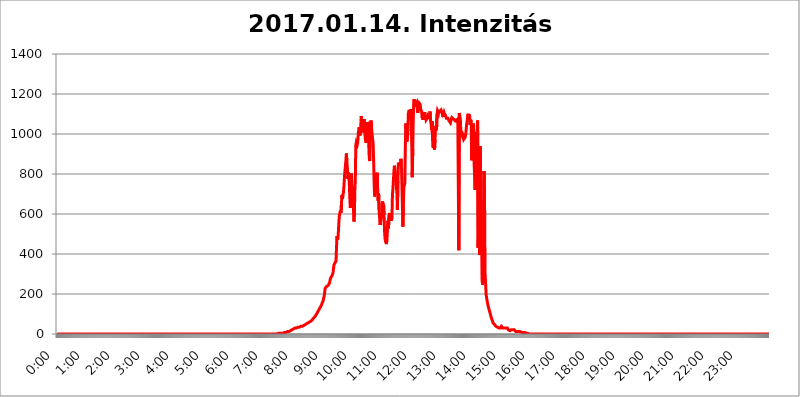
| Category | 2017.01.14. Intenzitás [W/m^2] |
|---|---|
| 0.0 | 0 |
| 0.0006944444444444445 | 0 |
| 0.001388888888888889 | 0 |
| 0.0020833333333333333 | 0 |
| 0.002777777777777778 | 0 |
| 0.003472222222222222 | 0 |
| 0.004166666666666667 | 0 |
| 0.004861111111111111 | 0 |
| 0.005555555555555556 | 0 |
| 0.0062499999999999995 | 0 |
| 0.006944444444444444 | 0 |
| 0.007638888888888889 | 0 |
| 0.008333333333333333 | 0 |
| 0.009027777777777779 | 0 |
| 0.009722222222222222 | 0 |
| 0.010416666666666666 | 0 |
| 0.011111111111111112 | 0 |
| 0.011805555555555555 | 0 |
| 0.012499999999999999 | 0 |
| 0.013194444444444444 | 0 |
| 0.013888888888888888 | 0 |
| 0.014583333333333332 | 0 |
| 0.015277777777777777 | 0 |
| 0.015972222222222224 | 0 |
| 0.016666666666666666 | 0 |
| 0.017361111111111112 | 0 |
| 0.018055555555555557 | 0 |
| 0.01875 | 0 |
| 0.019444444444444445 | 0 |
| 0.02013888888888889 | 0 |
| 0.020833333333333332 | 0 |
| 0.02152777777777778 | 0 |
| 0.022222222222222223 | 0 |
| 0.02291666666666667 | 0 |
| 0.02361111111111111 | 0 |
| 0.024305555555555556 | 0 |
| 0.024999999999999998 | 0 |
| 0.025694444444444447 | 0 |
| 0.02638888888888889 | 0 |
| 0.027083333333333334 | 0 |
| 0.027777777777777776 | 0 |
| 0.02847222222222222 | 0 |
| 0.029166666666666664 | 0 |
| 0.029861111111111113 | 0 |
| 0.030555555555555555 | 0 |
| 0.03125 | 0 |
| 0.03194444444444445 | 0 |
| 0.03263888888888889 | 0 |
| 0.03333333333333333 | 0 |
| 0.034027777777777775 | 0 |
| 0.034722222222222224 | 0 |
| 0.035416666666666666 | 0 |
| 0.036111111111111115 | 0 |
| 0.03680555555555556 | 0 |
| 0.0375 | 0 |
| 0.03819444444444444 | 0 |
| 0.03888888888888889 | 0 |
| 0.03958333333333333 | 0 |
| 0.04027777777777778 | 0 |
| 0.04097222222222222 | 0 |
| 0.041666666666666664 | 0 |
| 0.042361111111111106 | 0 |
| 0.04305555555555556 | 0 |
| 0.043750000000000004 | 0 |
| 0.044444444444444446 | 0 |
| 0.04513888888888889 | 0 |
| 0.04583333333333334 | 0 |
| 0.04652777777777778 | 0 |
| 0.04722222222222222 | 0 |
| 0.04791666666666666 | 0 |
| 0.04861111111111111 | 0 |
| 0.049305555555555554 | 0 |
| 0.049999999999999996 | 0 |
| 0.05069444444444445 | 0 |
| 0.051388888888888894 | 0 |
| 0.052083333333333336 | 0 |
| 0.05277777777777778 | 0 |
| 0.05347222222222222 | 0 |
| 0.05416666666666667 | 0 |
| 0.05486111111111111 | 0 |
| 0.05555555555555555 | 0 |
| 0.05625 | 0 |
| 0.05694444444444444 | 0 |
| 0.057638888888888885 | 0 |
| 0.05833333333333333 | 0 |
| 0.05902777777777778 | 0 |
| 0.059722222222222225 | 0 |
| 0.06041666666666667 | 0 |
| 0.061111111111111116 | 0 |
| 0.06180555555555556 | 0 |
| 0.0625 | 0 |
| 0.06319444444444444 | 0 |
| 0.06388888888888888 | 0 |
| 0.06458333333333334 | 0 |
| 0.06527777777777778 | 0 |
| 0.06597222222222222 | 0 |
| 0.06666666666666667 | 0 |
| 0.06736111111111111 | 0 |
| 0.06805555555555555 | 0 |
| 0.06874999999999999 | 0 |
| 0.06944444444444443 | 0 |
| 0.07013888888888889 | 0 |
| 0.07083333333333333 | 0 |
| 0.07152777777777779 | 0 |
| 0.07222222222222223 | 0 |
| 0.07291666666666667 | 0 |
| 0.07361111111111111 | 0 |
| 0.07430555555555556 | 0 |
| 0.075 | 0 |
| 0.07569444444444444 | 0 |
| 0.0763888888888889 | 0 |
| 0.07708333333333334 | 0 |
| 0.07777777777777778 | 0 |
| 0.07847222222222222 | 0 |
| 0.07916666666666666 | 0 |
| 0.0798611111111111 | 0 |
| 0.08055555555555556 | 0 |
| 0.08125 | 0 |
| 0.08194444444444444 | 0 |
| 0.08263888888888889 | 0 |
| 0.08333333333333333 | 0 |
| 0.08402777777777777 | 0 |
| 0.08472222222222221 | 0 |
| 0.08541666666666665 | 0 |
| 0.08611111111111112 | 0 |
| 0.08680555555555557 | 0 |
| 0.08750000000000001 | 0 |
| 0.08819444444444445 | 0 |
| 0.08888888888888889 | 0 |
| 0.08958333333333333 | 0 |
| 0.09027777777777778 | 0 |
| 0.09097222222222222 | 0 |
| 0.09166666666666667 | 0 |
| 0.09236111111111112 | 0 |
| 0.09305555555555556 | 0 |
| 0.09375 | 0 |
| 0.09444444444444444 | 0 |
| 0.09513888888888888 | 0 |
| 0.09583333333333333 | 0 |
| 0.09652777777777777 | 0 |
| 0.09722222222222222 | 0 |
| 0.09791666666666667 | 0 |
| 0.09861111111111111 | 0 |
| 0.09930555555555555 | 0 |
| 0.09999999999999999 | 0 |
| 0.10069444444444443 | 0 |
| 0.1013888888888889 | 0 |
| 0.10208333333333335 | 0 |
| 0.10277777777777779 | 0 |
| 0.10347222222222223 | 0 |
| 0.10416666666666667 | 0 |
| 0.10486111111111111 | 0 |
| 0.10555555555555556 | 0 |
| 0.10625 | 0 |
| 0.10694444444444444 | 0 |
| 0.1076388888888889 | 0 |
| 0.10833333333333334 | 0 |
| 0.10902777777777778 | 0 |
| 0.10972222222222222 | 0 |
| 0.1111111111111111 | 0 |
| 0.11180555555555556 | 0 |
| 0.11180555555555556 | 0 |
| 0.1125 | 0 |
| 0.11319444444444444 | 0 |
| 0.11388888888888889 | 0 |
| 0.11458333333333333 | 0 |
| 0.11527777777777777 | 0 |
| 0.11597222222222221 | 0 |
| 0.11666666666666665 | 0 |
| 0.1173611111111111 | 0 |
| 0.11805555555555557 | 0 |
| 0.11944444444444445 | 0 |
| 0.12013888888888889 | 0 |
| 0.12083333333333333 | 0 |
| 0.12152777777777778 | 0 |
| 0.12222222222222223 | 0 |
| 0.12291666666666667 | 0 |
| 0.12291666666666667 | 0 |
| 0.12361111111111112 | 0 |
| 0.12430555555555556 | 0 |
| 0.125 | 0 |
| 0.12569444444444444 | 0 |
| 0.12638888888888888 | 0 |
| 0.12708333333333333 | 0 |
| 0.16875 | 0 |
| 0.12847222222222224 | 0 |
| 0.12916666666666668 | 0 |
| 0.12986111111111112 | 0 |
| 0.13055555555555556 | 0 |
| 0.13125 | 0 |
| 0.13194444444444445 | 0 |
| 0.1326388888888889 | 0 |
| 0.13333333333333333 | 0 |
| 0.13402777777777777 | 0 |
| 0.13402777777777777 | 0 |
| 0.13472222222222222 | 0 |
| 0.13541666666666666 | 0 |
| 0.1361111111111111 | 0 |
| 0.13749999999999998 | 0 |
| 0.13819444444444443 | 0 |
| 0.1388888888888889 | 0 |
| 0.13958333333333334 | 0 |
| 0.14027777777777778 | 0 |
| 0.14097222222222222 | 0 |
| 0.14166666666666666 | 0 |
| 0.1423611111111111 | 0 |
| 0.14305555555555557 | 0 |
| 0.14375000000000002 | 0 |
| 0.14444444444444446 | 0 |
| 0.1451388888888889 | 0 |
| 0.1451388888888889 | 0 |
| 0.14652777777777778 | 0 |
| 0.14722222222222223 | 0 |
| 0.14791666666666667 | 0 |
| 0.1486111111111111 | 0 |
| 0.14930555555555555 | 0 |
| 0.15 | 0 |
| 0.15069444444444444 | 0 |
| 0.15138888888888888 | 0 |
| 0.15208333333333332 | 0 |
| 0.15277777777777776 | 0 |
| 0.15347222222222223 | 0 |
| 0.15416666666666667 | 0 |
| 0.15486111111111112 | 0 |
| 0.15555555555555556 | 0 |
| 0.15625 | 0 |
| 0.15694444444444444 | 0 |
| 0.15763888888888888 | 0 |
| 0.15833333333333333 | 0 |
| 0.15902777777777777 | 0 |
| 0.15972222222222224 | 0 |
| 0.16041666666666668 | 0 |
| 0.16111111111111112 | 0 |
| 0.16180555555555556 | 0 |
| 0.1625 | 0 |
| 0.16319444444444445 | 0 |
| 0.1638888888888889 | 0 |
| 0.16458333333333333 | 0 |
| 0.16527777777777777 | 0 |
| 0.16597222222222222 | 0 |
| 0.16666666666666666 | 0 |
| 0.1673611111111111 | 0 |
| 0.16805555555555554 | 0 |
| 0.16874999999999998 | 0 |
| 0.16944444444444443 | 0 |
| 0.17013888888888887 | 0 |
| 0.1708333333333333 | 0 |
| 0.17152777777777775 | 0 |
| 0.17222222222222225 | 0 |
| 0.1729166666666667 | 0 |
| 0.17361111111111113 | 0 |
| 0.17430555555555557 | 0 |
| 0.17500000000000002 | 0 |
| 0.17569444444444446 | 0 |
| 0.1763888888888889 | 0 |
| 0.17708333333333334 | 0 |
| 0.17777777777777778 | 0 |
| 0.17847222222222223 | 0 |
| 0.17916666666666667 | 0 |
| 0.1798611111111111 | 0 |
| 0.18055555555555555 | 0 |
| 0.18125 | 0 |
| 0.18194444444444444 | 0 |
| 0.1826388888888889 | 0 |
| 0.18333333333333335 | 0 |
| 0.1840277777777778 | 0 |
| 0.18472222222222223 | 0 |
| 0.18541666666666667 | 0 |
| 0.18611111111111112 | 0 |
| 0.18680555555555556 | 0 |
| 0.1875 | 0 |
| 0.18819444444444444 | 0 |
| 0.18888888888888888 | 0 |
| 0.18958333333333333 | 0 |
| 0.19027777777777777 | 0 |
| 0.1909722222222222 | 0 |
| 0.19166666666666665 | 0 |
| 0.19236111111111112 | 0 |
| 0.19305555555555554 | 0 |
| 0.19375 | 0 |
| 0.19444444444444445 | 0 |
| 0.1951388888888889 | 0 |
| 0.19583333333333333 | 0 |
| 0.19652777777777777 | 0 |
| 0.19722222222222222 | 0 |
| 0.19791666666666666 | 0 |
| 0.1986111111111111 | 0 |
| 0.19930555555555554 | 0 |
| 0.19999999999999998 | 0 |
| 0.20069444444444443 | 0 |
| 0.20138888888888887 | 0 |
| 0.2020833333333333 | 0 |
| 0.2027777777777778 | 0 |
| 0.2034722222222222 | 0 |
| 0.2041666666666667 | 0 |
| 0.20486111111111113 | 0 |
| 0.20555555555555557 | 0 |
| 0.20625000000000002 | 0 |
| 0.20694444444444446 | 0 |
| 0.2076388888888889 | 0 |
| 0.20833333333333334 | 0 |
| 0.20902777777777778 | 0 |
| 0.20972222222222223 | 0 |
| 0.21041666666666667 | 0 |
| 0.2111111111111111 | 0 |
| 0.21180555555555555 | 0 |
| 0.2125 | 0 |
| 0.21319444444444444 | 0 |
| 0.2138888888888889 | 0 |
| 0.21458333333333335 | 0 |
| 0.2152777777777778 | 0 |
| 0.21597222222222223 | 0 |
| 0.21666666666666667 | 0 |
| 0.21736111111111112 | 0 |
| 0.21805555555555556 | 0 |
| 0.21875 | 0 |
| 0.21944444444444444 | 0 |
| 0.22013888888888888 | 0 |
| 0.22083333333333333 | 0 |
| 0.22152777777777777 | 0 |
| 0.2222222222222222 | 0 |
| 0.22291666666666665 | 0 |
| 0.2236111111111111 | 0 |
| 0.22430555555555556 | 0 |
| 0.225 | 0 |
| 0.22569444444444445 | 0 |
| 0.2263888888888889 | 0 |
| 0.22708333333333333 | 0 |
| 0.22777777777777777 | 0 |
| 0.22847222222222222 | 0 |
| 0.22916666666666666 | 0 |
| 0.2298611111111111 | 0 |
| 0.23055555555555554 | 0 |
| 0.23124999999999998 | 0 |
| 0.23194444444444443 | 0 |
| 0.23263888888888887 | 0 |
| 0.2333333333333333 | 0 |
| 0.2340277777777778 | 0 |
| 0.2347222222222222 | 0 |
| 0.2354166666666667 | 0 |
| 0.23611111111111113 | 0 |
| 0.23680555555555557 | 0 |
| 0.23750000000000002 | 0 |
| 0.23819444444444446 | 0 |
| 0.2388888888888889 | 0 |
| 0.23958333333333334 | 0 |
| 0.24027777777777778 | 0 |
| 0.24097222222222223 | 0 |
| 0.24166666666666667 | 0 |
| 0.2423611111111111 | 0 |
| 0.24305555555555555 | 0 |
| 0.24375 | 0 |
| 0.24444444444444446 | 0 |
| 0.24513888888888888 | 0 |
| 0.24583333333333335 | 0 |
| 0.2465277777777778 | 0 |
| 0.24722222222222223 | 0 |
| 0.24791666666666667 | 0 |
| 0.24861111111111112 | 0 |
| 0.24930555555555556 | 0 |
| 0.25 | 0 |
| 0.25069444444444444 | 0 |
| 0.2513888888888889 | 0 |
| 0.2520833333333333 | 0 |
| 0.25277777777777777 | 0 |
| 0.2534722222222222 | 0 |
| 0.25416666666666665 | 0 |
| 0.2548611111111111 | 0 |
| 0.2555555555555556 | 0 |
| 0.25625000000000003 | 0 |
| 0.2569444444444445 | 0 |
| 0.2576388888888889 | 0 |
| 0.25833333333333336 | 0 |
| 0.2590277777777778 | 0 |
| 0.25972222222222224 | 0 |
| 0.2604166666666667 | 0 |
| 0.2611111111111111 | 0 |
| 0.26180555555555557 | 0 |
| 0.2625 | 0 |
| 0.26319444444444445 | 0 |
| 0.2638888888888889 | 0 |
| 0.26458333333333334 | 0 |
| 0.2652777777777778 | 0 |
| 0.2659722222222222 | 0 |
| 0.26666666666666666 | 0 |
| 0.2673611111111111 | 0 |
| 0.26805555555555555 | 0 |
| 0.26875 | 0 |
| 0.26944444444444443 | 0 |
| 0.2701388888888889 | 0 |
| 0.2708333333333333 | 0 |
| 0.27152777777777776 | 0 |
| 0.2722222222222222 | 0 |
| 0.27291666666666664 | 0 |
| 0.2736111111111111 | 0 |
| 0.2743055555555555 | 0 |
| 0.27499999999999997 | 0 |
| 0.27569444444444446 | 0 |
| 0.27638888888888885 | 0 |
| 0.27708333333333335 | 0 |
| 0.2777777777777778 | 0 |
| 0.27847222222222223 | 0 |
| 0.2791666666666667 | 0 |
| 0.2798611111111111 | 0 |
| 0.28055555555555556 | 0 |
| 0.28125 | 0 |
| 0.28194444444444444 | 0 |
| 0.2826388888888889 | 0 |
| 0.2833333333333333 | 0 |
| 0.28402777777777777 | 0 |
| 0.2847222222222222 | 0 |
| 0.28541666666666665 | 0 |
| 0.28611111111111115 | 0 |
| 0.28680555555555554 | 0 |
| 0.28750000000000003 | 0 |
| 0.2881944444444445 | 0 |
| 0.2888888888888889 | 0 |
| 0.28958333333333336 | 0 |
| 0.2902777777777778 | 0 |
| 0.29097222222222224 | 0 |
| 0.2916666666666667 | 0 |
| 0.2923611111111111 | 0 |
| 0.29305555555555557 | 0 |
| 0.29375 | 0 |
| 0.29444444444444445 | 0 |
| 0.2951388888888889 | 0 |
| 0.29583333333333334 | 0 |
| 0.2965277777777778 | 0 |
| 0.2972222222222222 | 0 |
| 0.29791666666666666 | 0 |
| 0.2986111111111111 | 0 |
| 0.29930555555555555 | 0 |
| 0.3 | 0 |
| 0.30069444444444443 | 0 |
| 0.3013888888888889 | 0 |
| 0.3020833333333333 | 0 |
| 0.30277777777777776 | 0 |
| 0.3034722222222222 | 0 |
| 0.30416666666666664 | 0 |
| 0.3048611111111111 | 0 |
| 0.3055555555555555 | 0 |
| 0.30624999999999997 | 0 |
| 0.3069444444444444 | 0 |
| 0.3076388888888889 | 0 |
| 0.30833333333333335 | 0 |
| 0.3090277777777778 | 0 |
| 0.30972222222222223 | 3.525 |
| 0.3104166666666667 | 3.525 |
| 0.3111111111111111 | 3.525 |
| 0.31180555555555556 | 3.525 |
| 0.3125 | 3.525 |
| 0.31319444444444444 | 3.525 |
| 0.3138888888888889 | 3.525 |
| 0.3145833333333333 | 3.525 |
| 0.31527777777777777 | 3.525 |
| 0.3159722222222222 | 3.525 |
| 0.31666666666666665 | 3.525 |
| 0.31736111111111115 | 7.887 |
| 0.31805555555555554 | 7.887 |
| 0.31875000000000003 | 7.887 |
| 0.3194444444444445 | 7.887 |
| 0.3201388888888889 | 7.887 |
| 0.32083333333333336 | 7.887 |
| 0.3215277777777778 | 12.257 |
| 0.32222222222222224 | 12.257 |
| 0.3229166666666667 | 12.257 |
| 0.3236111111111111 | 12.257 |
| 0.32430555555555557 | 12.257 |
| 0.325 | 12.257 |
| 0.32569444444444445 | 16.636 |
| 0.3263888888888889 | 16.636 |
| 0.32708333333333334 | 16.636 |
| 0.3277777777777778 | 21.024 |
| 0.3284722222222222 | 21.024 |
| 0.32916666666666666 | 21.024 |
| 0.3298611111111111 | 21.024 |
| 0.33055555555555555 | 25.419 |
| 0.33125 | 25.419 |
| 0.33194444444444443 | 25.419 |
| 0.3326388888888889 | 25.419 |
| 0.3333333333333333 | 29.823 |
| 0.3340277777777778 | 29.823 |
| 0.3347222222222222 | 29.823 |
| 0.3354166666666667 | 29.823 |
| 0.3361111111111111 | 29.823 |
| 0.3368055555555556 | 34.234 |
| 0.33749999999999997 | 34.234 |
| 0.33819444444444446 | 34.234 |
| 0.33888888888888885 | 34.234 |
| 0.33958333333333335 | 34.234 |
| 0.34027777777777773 | 34.234 |
| 0.34097222222222223 | 38.653 |
| 0.3416666666666666 | 38.653 |
| 0.3423611111111111 | 38.653 |
| 0.3430555555555555 | 38.653 |
| 0.34375 | 38.653 |
| 0.3444444444444445 | 38.653 |
| 0.3451388888888889 | 38.653 |
| 0.3458333333333334 | 43.079 |
| 0.34652777777777777 | 43.079 |
| 0.34722222222222227 | 47.511 |
| 0.34791666666666665 | 47.511 |
| 0.34861111111111115 | 47.511 |
| 0.34930555555555554 | 51.951 |
| 0.35000000000000003 | 51.951 |
| 0.3506944444444444 | 51.951 |
| 0.3513888888888889 | 56.398 |
| 0.3520833333333333 | 56.398 |
| 0.3527777777777778 | 56.398 |
| 0.3534722222222222 | 56.398 |
| 0.3541666666666667 | 60.85 |
| 0.3548611111111111 | 60.85 |
| 0.35555555555555557 | 65.31 |
| 0.35625 | 65.31 |
| 0.35694444444444445 | 65.31 |
| 0.3576388888888889 | 69.775 |
| 0.35833333333333334 | 74.246 |
| 0.3590277777777778 | 74.246 |
| 0.3597222222222222 | 78.722 |
| 0.36041666666666666 | 83.205 |
| 0.3611111111111111 | 83.205 |
| 0.36180555555555555 | 87.692 |
| 0.3625 | 92.184 |
| 0.36319444444444443 | 92.184 |
| 0.3638888888888889 | 101.184 |
| 0.3645833333333333 | 101.184 |
| 0.3652777777777778 | 110.201 |
| 0.3659722222222222 | 114.716 |
| 0.3666666666666667 | 119.235 |
| 0.3673611111111111 | 123.758 |
| 0.3680555555555556 | 128.284 |
| 0.36874999999999997 | 132.814 |
| 0.36944444444444446 | 137.347 |
| 0.37013888888888885 | 141.884 |
| 0.37083333333333335 | 146.423 |
| 0.37152777777777773 | 155.509 |
| 0.37222222222222223 | 155.509 |
| 0.3729166666666666 | 164.605 |
| 0.3736111111111111 | 178.264 |
| 0.3743055555555555 | 187.378 |
| 0.375 | 205.62 |
| 0.3756944444444445 | 228.436 |
| 0.3763888888888889 | 233 |
| 0.3770833333333334 | 233 |
| 0.37777777777777777 | 237.564 |
| 0.37847222222222227 | 237.564 |
| 0.37916666666666665 | 242.127 |
| 0.37986111111111115 | 242.127 |
| 0.38055555555555554 | 242.127 |
| 0.38125000000000003 | 246.689 |
| 0.3819444444444444 | 255.813 |
| 0.3826388888888889 | 269.49 |
| 0.3833333333333333 | 278.603 |
| 0.3840277777777778 | 283.156 |
| 0.3847222222222222 | 283.156 |
| 0.3854166666666667 | 292.259 |
| 0.3861111111111111 | 296.808 |
| 0.38680555555555557 | 305.898 |
| 0.3875 | 328.584 |
| 0.38819444444444445 | 346.682 |
| 0.3888888888888889 | 346.682 |
| 0.38958333333333334 | 355.712 |
| 0.3902777777777778 | 360.221 |
| 0.3909722222222222 | 364.728 |
| 0.39166666666666666 | 431.833 |
| 0.3923611111111111 | 489.108 |
| 0.39305555555555555 | 471.582 |
| 0.39375 | 480.356 |
| 0.39444444444444443 | 519.555 |
| 0.3951388888888889 | 566.793 |
| 0.3958333333333333 | 596.45 |
| 0.3965277777777778 | 600.661 |
| 0.3972222222222222 | 617.436 |
| 0.3979166666666667 | 604.864 |
| 0.3986111111111111 | 650.667 |
| 0.3993055555555556 | 695.666 |
| 0.39999999999999997 | 675.311 |
| 0.40069444444444446 | 695.666 |
| 0.40138888888888885 | 707.8 |
| 0.40208333333333335 | 739.877 |
| 0.40277777777777773 | 783.342 |
| 0.40347222222222223 | 814.519 |
| 0.4041666666666666 | 841.526 |
| 0.4048611111111111 | 868.305 |
| 0.4055555555555555 | 902.447 |
| 0.40625 | 853.029 |
| 0.4069444444444445 | 829.981 |
| 0.4076388888888889 | 775.492 |
| 0.4083333333333334 | 806.757 |
| 0.40902777777777777 | 783.342 |
| 0.40972222222222227 | 743.859 |
| 0.41041666666666665 | 675.311 |
| 0.41111111111111115 | 629.948 |
| 0.41180555555555554 | 703.762 |
| 0.41250000000000003 | 802.868 |
| 0.4131944444444444 | 743.859 |
| 0.4138888888888889 | 711.832 |
| 0.4145833333333333 | 735.89 |
| 0.4152777777777778 | 642.4 |
| 0.4159722222222222 | 562.53 |
| 0.4166666666666667 | 571.049 |
| 0.4173611111111111 | 715.858 |
| 0.41805555555555557 | 771.559 |
| 0.41875 | 943.832 |
| 0.41944444444444445 | 958.814 |
| 0.4201388888888889 | 962.555 |
| 0.42083333333333334 | 947.58 |
| 0.4215277777777778 | 958.814 |
| 0.4222222222222222 | 1003.65 |
| 0.42291666666666666 | 1022.323 |
| 0.4236111111111111 | 1033.537 |
| 0.42430555555555555 | 992.448 |
| 0.425 | 1007.383 |
| 0.42569444444444443 | 1041.019 |
| 0.4263888888888889 | 1089.873 |
| 0.4270833333333333 | 1067.267 |
| 0.4277777777777778 | 1037.277 |
| 0.4284722222222222 | 1007.383 |
| 0.4291666666666667 | 1029.798 |
| 0.4298611111111111 | 1056.004 |
| 0.4305555555555556 | 1074.789 |
| 0.43124999999999997 | 1029.798 |
| 0.43194444444444446 | 977.508 |
| 0.43263888888888885 | 973.772 |
| 0.43333333333333335 | 955.071 |
| 0.43402777777777773 | 1029.798 |
| 0.43472222222222223 | 1059.756 |
| 0.4354166666666666 | 1052.255 |
| 0.4361111111111111 | 1022.323 |
| 0.4368055555555555 | 1022.323 |
| 0.4375 | 887.309 |
| 0.4381944444444445 | 864.493 |
| 0.4388888888888889 | 1026.06 |
| 0.4395833333333334 | 1059.756 |
| 0.44027777777777777 | 1067.267 |
| 0.44097222222222227 | 1018.587 |
| 0.44166666666666665 | 1014.852 |
| 0.44236111111111115 | 973.772 |
| 0.44305555555555554 | 947.58 |
| 0.44375000000000003 | 864.493 |
| 0.4444444444444444 | 755.766 |
| 0.4451388888888889 | 687.544 |
| 0.4458333333333333 | 699.717 |
| 0.4465277777777778 | 703.762 |
| 0.4472222222222222 | 755.766 |
| 0.4479166666666667 | 798.974 |
| 0.4486111111111111 | 806.757 |
| 0.44930555555555557 | 735.89 |
| 0.45 | 667.123 |
| 0.45069444444444445 | 703.762 |
| 0.4513888888888889 | 621.613 |
| 0.45208333333333334 | 583.779 |
| 0.4527777777777778 | 545.416 |
| 0.4534722222222222 | 558.261 |
| 0.45416666666666666 | 571.049 |
| 0.4548611111111111 | 583.779 |
| 0.45555555555555555 | 621.613 |
| 0.45625 | 663.019 |
| 0.45694444444444443 | 638.256 |
| 0.4576388888888889 | 650.667 |
| 0.4583333333333333 | 596.45 |
| 0.4590277777777778 | 515.223 |
| 0.4597222222222222 | 475.972 |
| 0.4604166666666667 | 462.786 |
| 0.4611111111111111 | 467.187 |
| 0.4618055555555556 | 449.551 |
| 0.46249999999999997 | 453.968 |
| 0.46319444444444446 | 545.416 |
| 0.46388888888888885 | 566.793 |
| 0.46458333333333335 | 528.2 |
| 0.46527777777777773 | 592.233 |
| 0.46597222222222223 | 604.864 |
| 0.4666666666666666 | 566.793 |
| 0.4673611111111111 | 571.049 |
| 0.4680555555555555 | 604.864 |
| 0.46875 | 566.793 |
| 0.4694444444444445 | 588.009 |
| 0.4701388888888889 | 695.666 |
| 0.4708333333333334 | 727.896 |
| 0.47152777777777777 | 771.559 |
| 0.47222222222222227 | 814.519 |
| 0.47291666666666665 | 841.526 |
| 0.47361111111111115 | 841.526 |
| 0.47430555555555554 | 791.169 |
| 0.47500000000000003 | 771.559 |
| 0.4756944444444444 | 735.89 |
| 0.4763888888888889 | 703.762 |
| 0.4770833333333333 | 621.613 |
| 0.4777777777777778 | 763.674 |
| 0.4784722222222222 | 856.855 |
| 0.4791666666666667 | 849.199 |
| 0.4798611111111111 | 853.029 |
| 0.48055555555555557 | 845.365 |
| 0.48125 | 849.199 |
| 0.48194444444444445 | 875.918 |
| 0.4826388888888889 | 856.855 |
| 0.48333333333333334 | 860.676 |
| 0.4840277777777778 | 654.791 |
| 0.4847222222222222 | 536.82 |
| 0.48541666666666666 | 638.256 |
| 0.4861111111111111 | 731.896 |
| 0.48680555555555555 | 731.896 |
| 0.4875 | 755.766 |
| 0.48819444444444443 | 936.33 |
| 0.4888888888888889 | 1052.255 |
| 0.4895833333333333 | 1052.255 |
| 0.4902777777777778 | 962.555 |
| 0.4909722222222222 | 984.98 |
| 0.4916666666666667 | 999.916 |
| 0.4923611111111111 | 1101.226 |
| 0.4930555555555556 | 1112.618 |
| 0.49374999999999997 | 1120.238 |
| 0.49444444444444446 | 1116.426 |
| 0.49513888888888885 | 1078.555 |
| 0.49583333333333335 | 1124.056 |
| 0.49652777777777773 | 1044.762 |
| 0.49722222222222223 | 940.082 |
| 0.4979166666666666 | 783.342 |
| 0.4986111111111111 | 925.06 |
| 0.4993055555555555 | 1071.027 |
| 0.5 | 1162.571 |
| 0.5006944444444444 | 1174.263 |
| 0.5013888888888889 | 1143.232 |
| 0.5020833333333333 | 1162.571 |
| 0.5027777777777778 | 1150.946 |
| 0.5034722222222222 | 1154.814 |
| 0.5041666666666667 | 1158.689 |
| 0.5048611111111111 | 1131.708 |
| 0.5055555555555555 | 1105.019 |
| 0.50625 | 1131.708 |
| 0.5069444444444444 | 1147.086 |
| 0.5076388888888889 | 1154.814 |
| 0.5083333333333333 | 1150.946 |
| 0.5090277777777777 | 1147.086 |
| 0.5097222222222222 | 1124.056 |
| 0.5104166666666666 | 1127.879 |
| 0.5111111111111112 | 1112.618 |
| 0.5118055555555555 | 1078.555 |
| 0.5125000000000001 | 1086.097 |
| 0.5131944444444444 | 1071.027 |
| 0.513888888888889 | 1074.789 |
| 0.5145833333333333 | 1108.816 |
| 0.5152777777777778 | 1093.653 |
| 0.5159722222222222 | 1082.324 |
| 0.5166666666666667 | 1093.653 |
| 0.517361111111111 | 1071.027 |
| 0.5180555555555556 | 1067.267 |
| 0.5187499999999999 | 1078.555 |
| 0.5194444444444445 | 1093.653 |
| 0.5201388888888888 | 1097.437 |
| 0.5208333333333334 | 1086.097 |
| 0.5215277777777778 | 1086.097 |
| 0.5222222222222223 | 1093.653 |
| 0.5229166666666667 | 1112.618 |
| 0.5236111111111111 | 1067.267 |
| 0.5243055555555556 | 1052.255 |
| 0.525 | 1022.323 |
| 0.5256944444444445 | 1063.51 |
| 0.5263888888888889 | 970.034 |
| 0.5270833333333333 | 932.576 |
| 0.5277777777777778 | 951.327 |
| 0.5284722222222222 | 947.58 |
| 0.5291666666666667 | 921.298 |
| 0.5298611111111111 | 973.772 |
| 0.5305555555555556 | 1033.537 |
| 0.53125 | 1041.019 |
| 0.5319444444444444 | 1018.587 |
| 0.5326388888888889 | 1097.437 |
| 0.5333333333333333 | 1116.426 |
| 0.5340277777777778 | 1112.618 |
| 0.5347222222222222 | 1105.019 |
| 0.5354166666666667 | 1120.238 |
| 0.5361111111111111 | 1112.618 |
| 0.5368055555555555 | 1116.426 |
| 0.5375 | 1112.618 |
| 0.5381944444444444 | 1120.238 |
| 0.5388888888888889 | 1124.056 |
| 0.5395833333333333 | 1105.019 |
| 0.5402777777777777 | 1116.426 |
| 0.5409722222222222 | 1086.097 |
| 0.5416666666666666 | 1101.226 |
| 0.5423611111111112 | 1108.816 |
| 0.5430555555555555 | 1101.226 |
| 0.5437500000000001 | 1097.437 |
| 0.5444444444444444 | 1093.653 |
| 0.545138888888889 | 1089.873 |
| 0.5458333333333333 | 1078.555 |
| 0.5465277777777778 | 1082.324 |
| 0.5472222222222222 | 1078.555 |
| 0.5479166666666667 | 1078.555 |
| 0.548611111111111 | 1074.789 |
| 0.5493055555555556 | 1067.267 |
| 0.5499999999999999 | 1067.267 |
| 0.5506944444444445 | 1063.51 |
| 0.5513888888888888 | 1056.004 |
| 0.5520833333333334 | 1052.255 |
| 0.5527777777777778 | 1074.789 |
| 0.5534722222222223 | 1082.324 |
| 0.5541666666666667 | 1078.555 |
| 0.5548611111111111 | 1078.555 |
| 0.5555555555555556 | 1074.789 |
| 0.55625 | 1074.789 |
| 0.5569444444444445 | 1074.789 |
| 0.5576388888888889 | 1071.027 |
| 0.5583333333333333 | 1059.756 |
| 0.5590277777777778 | 1074.789 |
| 0.5597222222222222 | 1067.267 |
| 0.5604166666666667 | 1067.267 |
| 0.5611111111111111 | 1067.267 |
| 0.5618055555555556 | 1074.789 |
| 0.5625 | 1078.555 |
| 0.5631944444444444 | 418.492 |
| 0.5638888888888889 | 1105.019 |
| 0.5645833333333333 | 1086.097 |
| 0.5652777777777778 | 1078.555 |
| 0.5659722222222222 | 1014.852 |
| 0.5666666666666667 | 999.916 |
| 0.5673611111111111 | 996.182 |
| 0.5680555555555555 | 988.714 |
| 0.56875 | 996.182 |
| 0.5694444444444444 | 988.714 |
| 0.5701388888888889 | 973.772 |
| 0.5708333333333333 | 977.508 |
| 0.5715277777777777 | 973.772 |
| 0.5722222222222222 | 984.98 |
| 0.5729166666666666 | 999.916 |
| 0.5736111111111112 | 996.182 |
| 0.5743055555555555 | 1052.255 |
| 0.5750000000000001 | 1063.51 |
| 0.5756944444444444 | 1093.653 |
| 0.576388888888889 | 1101.226 |
| 0.5770833333333333 | 1074.789 |
| 0.5777777777777778 | 1097.437 |
| 0.5784722222222222 | 1086.097 |
| 0.5791666666666667 | 1044.762 |
| 0.579861111111111 | 1071.027 |
| 0.5805555555555556 | 1059.756 |
| 0.5812499999999999 | 868.305 |
| 0.5819444444444445 | 928.819 |
| 0.5826388888888888 | 996.182 |
| 0.5833333333333334 | 1052.255 |
| 0.5840277777777778 | 1003.65 |
| 0.5847222222222223 | 845.365 |
| 0.5854166666666667 | 783.342 |
| 0.5861111111111111 | 719.877 |
| 0.5868055555555556 | 1007.383 |
| 0.5875 | 883.516 |
| 0.5881944444444445 | 962.555 |
| 0.5888888888888889 | 1022.323 |
| 0.5895833333333333 | 1067.267 |
| 0.5902777777777778 | 431.833 |
| 0.5909722222222222 | 510.885 |
| 0.5916666666666667 | 826.123 |
| 0.5923611111111111 | 396.164 |
| 0.5930555555555556 | 940.082 |
| 0.59375 | 798.974 |
| 0.5944444444444444 | 735.89 |
| 0.5951388888888889 | 506.542 |
| 0.5958333333333333 | 269.49 |
| 0.5965277777777778 | 246.689 |
| 0.5972222222222222 | 292.259 |
| 0.5979166666666667 | 497.836 |
| 0.5986111111111111 | 814.519 |
| 0.5993055555555555 | 675.311 |
| 0.6 | 305.898 |
| 0.6006944444444444 | 260.373 |
| 0.6013888888888889 | 205.62 |
| 0.6020833333333333 | 182.82 |
| 0.6027777777777777 | 169.156 |
| 0.6034722222222222 | 155.509 |
| 0.6041666666666666 | 141.884 |
| 0.6048611111111112 | 132.814 |
| 0.6055555555555555 | 123.758 |
| 0.6062500000000001 | 114.716 |
| 0.6069444444444444 | 110.201 |
| 0.607638888888889 | 96.682 |
| 0.6083333333333333 | 87.692 |
| 0.6090277777777778 | 78.722 |
| 0.6097222222222222 | 74.246 |
| 0.6104166666666667 | 65.31 |
| 0.611111111111111 | 56.398 |
| 0.6118055555555556 | 56.398 |
| 0.6124999999999999 | 51.951 |
| 0.6131944444444445 | 47.511 |
| 0.6138888888888888 | 47.511 |
| 0.6145833333333334 | 43.079 |
| 0.6152777777777778 | 38.653 |
| 0.6159722222222223 | 38.653 |
| 0.6166666666666667 | 34.234 |
| 0.6173611111111111 | 34.234 |
| 0.6180555555555556 | 29.823 |
| 0.61875 | 29.823 |
| 0.6194444444444445 | 29.823 |
| 0.6201388888888889 | 29.823 |
| 0.6208333333333333 | 29.823 |
| 0.6215277777777778 | 29.823 |
| 0.6222222222222222 | 34.234 |
| 0.6229166666666667 | 38.653 |
| 0.6236111111111111 | 38.653 |
| 0.6243055555555556 | 34.234 |
| 0.625 | 29.823 |
| 0.6256944444444444 | 29.823 |
| 0.6263888888888889 | 29.823 |
| 0.6270833333333333 | 29.823 |
| 0.6277777777777778 | 29.823 |
| 0.6284722222222222 | 29.823 |
| 0.6291666666666667 | 29.823 |
| 0.6298611111111111 | 29.823 |
| 0.6305555555555555 | 29.823 |
| 0.63125 | 29.823 |
| 0.6319444444444444 | 25.419 |
| 0.6326388888888889 | 21.024 |
| 0.6333333333333333 | 16.636 |
| 0.6340277777777777 | 16.636 |
| 0.6347222222222222 | 16.636 |
| 0.6354166666666666 | 16.636 |
| 0.6361111111111112 | 16.636 |
| 0.6368055555555555 | 21.024 |
| 0.6375000000000001 | 21.024 |
| 0.6381944444444444 | 21.024 |
| 0.638888888888889 | 21.024 |
| 0.6395833333333333 | 25.419 |
| 0.6402777777777778 | 21.024 |
| 0.6409722222222222 | 21.024 |
| 0.6416666666666667 | 21.024 |
| 0.642361111111111 | 16.636 |
| 0.6430555555555556 | 12.257 |
| 0.6437499999999999 | 12.257 |
| 0.6444444444444445 | 12.257 |
| 0.6451388888888888 | 12.257 |
| 0.6458333333333334 | 12.257 |
| 0.6465277777777778 | 12.257 |
| 0.6472222222222223 | 12.257 |
| 0.6479166666666667 | 12.257 |
| 0.6486111111111111 | 12.257 |
| 0.6493055555555556 | 12.257 |
| 0.65 | 12.257 |
| 0.6506944444444445 | 7.887 |
| 0.6513888888888889 | 7.887 |
| 0.6520833333333333 | 7.887 |
| 0.6527777777777778 | 7.887 |
| 0.6534722222222222 | 7.887 |
| 0.6541666666666667 | 7.887 |
| 0.6548611111111111 | 7.887 |
| 0.6555555555555556 | 7.887 |
| 0.65625 | 7.887 |
| 0.6569444444444444 | 3.525 |
| 0.6576388888888889 | 3.525 |
| 0.6583333333333333 | 3.525 |
| 0.6590277777777778 | 3.525 |
| 0.6597222222222222 | 3.525 |
| 0.6604166666666667 | 3.525 |
| 0.6611111111111111 | 3.525 |
| 0.6618055555555555 | 0 |
| 0.6625 | 0 |
| 0.6631944444444444 | 0 |
| 0.6638888888888889 | 0 |
| 0.6645833333333333 | 0 |
| 0.6652777777777777 | 0 |
| 0.6659722222222222 | 0 |
| 0.6666666666666666 | 0 |
| 0.6673611111111111 | 0 |
| 0.6680555555555556 | 0 |
| 0.6687500000000001 | 0 |
| 0.6694444444444444 | 0 |
| 0.6701388888888888 | 0 |
| 0.6708333333333334 | 0 |
| 0.6715277777777778 | 0 |
| 0.6722222222222222 | 0 |
| 0.6729166666666666 | 0 |
| 0.6736111111111112 | 0 |
| 0.6743055555555556 | 0 |
| 0.6749999999999999 | 0 |
| 0.6756944444444444 | 0 |
| 0.6763888888888889 | 0 |
| 0.6770833333333334 | 0 |
| 0.6777777777777777 | 0 |
| 0.6784722222222223 | 0 |
| 0.6791666666666667 | 0 |
| 0.6798611111111111 | 0 |
| 0.6805555555555555 | 0 |
| 0.68125 | 0 |
| 0.6819444444444445 | 0 |
| 0.6826388888888889 | 0 |
| 0.6833333333333332 | 0 |
| 0.6840277777777778 | 0 |
| 0.6847222222222222 | 0 |
| 0.6854166666666667 | 0 |
| 0.686111111111111 | 0 |
| 0.6868055555555556 | 0 |
| 0.6875 | 0 |
| 0.6881944444444444 | 0 |
| 0.688888888888889 | 0 |
| 0.6895833333333333 | 0 |
| 0.6902777777777778 | 0 |
| 0.6909722222222222 | 0 |
| 0.6916666666666668 | 0 |
| 0.6923611111111111 | 0 |
| 0.6930555555555555 | 0 |
| 0.69375 | 0 |
| 0.6944444444444445 | 0 |
| 0.6951388888888889 | 0 |
| 0.6958333333333333 | 0 |
| 0.6965277777777777 | 0 |
| 0.6972222222222223 | 0 |
| 0.6979166666666666 | 0 |
| 0.6986111111111111 | 0 |
| 0.6993055555555556 | 0 |
| 0.7000000000000001 | 0 |
| 0.7006944444444444 | 0 |
| 0.7013888888888888 | 0 |
| 0.7020833333333334 | 0 |
| 0.7027777777777778 | 0 |
| 0.7034722222222222 | 0 |
| 0.7041666666666666 | 0 |
| 0.7048611111111112 | 0 |
| 0.7055555555555556 | 0 |
| 0.7062499999999999 | 0 |
| 0.7069444444444444 | 0 |
| 0.7076388888888889 | 0 |
| 0.7083333333333334 | 0 |
| 0.7090277777777777 | 0 |
| 0.7097222222222223 | 0 |
| 0.7104166666666667 | 0 |
| 0.7111111111111111 | 0 |
| 0.7118055555555555 | 0 |
| 0.7125 | 0 |
| 0.7131944444444445 | 0 |
| 0.7138888888888889 | 0 |
| 0.7145833333333332 | 0 |
| 0.7152777777777778 | 0 |
| 0.7159722222222222 | 0 |
| 0.7166666666666667 | 0 |
| 0.717361111111111 | 0 |
| 0.7180555555555556 | 0 |
| 0.71875 | 0 |
| 0.7194444444444444 | 0 |
| 0.720138888888889 | 0 |
| 0.7208333333333333 | 0 |
| 0.7215277777777778 | 0 |
| 0.7222222222222222 | 0 |
| 0.7229166666666668 | 0 |
| 0.7236111111111111 | 0 |
| 0.7243055555555555 | 0 |
| 0.725 | 0 |
| 0.7256944444444445 | 0 |
| 0.7263888888888889 | 0 |
| 0.7270833333333333 | 0 |
| 0.7277777777777777 | 0 |
| 0.7284722222222223 | 0 |
| 0.7291666666666666 | 0 |
| 0.7298611111111111 | 0 |
| 0.7305555555555556 | 0 |
| 0.7312500000000001 | 0 |
| 0.7319444444444444 | 0 |
| 0.7326388888888888 | 0 |
| 0.7333333333333334 | 0 |
| 0.7340277777777778 | 0 |
| 0.7347222222222222 | 0 |
| 0.7354166666666666 | 0 |
| 0.7361111111111112 | 0 |
| 0.7368055555555556 | 0 |
| 0.7374999999999999 | 0 |
| 0.7381944444444444 | 0 |
| 0.7388888888888889 | 0 |
| 0.7395833333333334 | 0 |
| 0.7402777777777777 | 0 |
| 0.7409722222222223 | 0 |
| 0.7416666666666667 | 0 |
| 0.7423611111111111 | 0 |
| 0.7430555555555555 | 0 |
| 0.74375 | 0 |
| 0.7444444444444445 | 0 |
| 0.7451388888888889 | 0 |
| 0.7458333333333332 | 0 |
| 0.7465277777777778 | 0 |
| 0.7472222222222222 | 0 |
| 0.7479166666666667 | 0 |
| 0.748611111111111 | 0 |
| 0.7493055555555556 | 0 |
| 0.75 | 0 |
| 0.7506944444444444 | 0 |
| 0.751388888888889 | 0 |
| 0.7520833333333333 | 0 |
| 0.7527777777777778 | 0 |
| 0.7534722222222222 | 0 |
| 0.7541666666666668 | 0 |
| 0.7548611111111111 | 0 |
| 0.7555555555555555 | 0 |
| 0.75625 | 0 |
| 0.7569444444444445 | 0 |
| 0.7576388888888889 | 0 |
| 0.7583333333333333 | 0 |
| 0.7590277777777777 | 0 |
| 0.7597222222222223 | 0 |
| 0.7604166666666666 | 0 |
| 0.7611111111111111 | 0 |
| 0.7618055555555556 | 0 |
| 0.7625000000000001 | 0 |
| 0.7631944444444444 | 0 |
| 0.7638888888888888 | 0 |
| 0.7645833333333334 | 0 |
| 0.7652777777777778 | 0 |
| 0.7659722222222222 | 0 |
| 0.7666666666666666 | 0 |
| 0.7673611111111112 | 0 |
| 0.7680555555555556 | 0 |
| 0.7687499999999999 | 0 |
| 0.7694444444444444 | 0 |
| 0.7701388888888889 | 0 |
| 0.7708333333333334 | 0 |
| 0.7715277777777777 | 0 |
| 0.7722222222222223 | 0 |
| 0.7729166666666667 | 0 |
| 0.7736111111111111 | 0 |
| 0.7743055555555555 | 0 |
| 0.775 | 0 |
| 0.7756944444444445 | 0 |
| 0.7763888888888889 | 0 |
| 0.7770833333333332 | 0 |
| 0.7777777777777778 | 0 |
| 0.7784722222222222 | 0 |
| 0.7791666666666667 | 0 |
| 0.779861111111111 | 0 |
| 0.7805555555555556 | 0 |
| 0.78125 | 0 |
| 0.7819444444444444 | 0 |
| 0.782638888888889 | 0 |
| 0.7833333333333333 | 0 |
| 0.7840277777777778 | 0 |
| 0.7847222222222222 | 0 |
| 0.7854166666666668 | 0 |
| 0.7861111111111111 | 0 |
| 0.7868055555555555 | 0 |
| 0.7875 | 0 |
| 0.7881944444444445 | 0 |
| 0.7888888888888889 | 0 |
| 0.7895833333333333 | 0 |
| 0.7902777777777777 | 0 |
| 0.7909722222222223 | 0 |
| 0.7916666666666666 | 0 |
| 0.7923611111111111 | 0 |
| 0.7930555555555556 | 0 |
| 0.7937500000000001 | 0 |
| 0.7944444444444444 | 0 |
| 0.7951388888888888 | 0 |
| 0.7958333333333334 | 0 |
| 0.7965277777777778 | 0 |
| 0.7972222222222222 | 0 |
| 0.7979166666666666 | 0 |
| 0.7986111111111112 | 0 |
| 0.7993055555555556 | 0 |
| 0.7999999999999999 | 0 |
| 0.8006944444444444 | 0 |
| 0.8013888888888889 | 0 |
| 0.8020833333333334 | 0 |
| 0.8027777777777777 | 0 |
| 0.8034722222222223 | 0 |
| 0.8041666666666667 | 0 |
| 0.8048611111111111 | 0 |
| 0.8055555555555555 | 0 |
| 0.80625 | 0 |
| 0.8069444444444445 | 0 |
| 0.8076388888888889 | 0 |
| 0.8083333333333332 | 0 |
| 0.8090277777777778 | 0 |
| 0.8097222222222222 | 0 |
| 0.8104166666666667 | 0 |
| 0.811111111111111 | 0 |
| 0.8118055555555556 | 0 |
| 0.8125 | 0 |
| 0.8131944444444444 | 0 |
| 0.813888888888889 | 0 |
| 0.8145833333333333 | 0 |
| 0.8152777777777778 | 0 |
| 0.8159722222222222 | 0 |
| 0.8166666666666668 | 0 |
| 0.8173611111111111 | 0 |
| 0.8180555555555555 | 0 |
| 0.81875 | 0 |
| 0.8194444444444445 | 0 |
| 0.8201388888888889 | 0 |
| 0.8208333333333333 | 0 |
| 0.8215277777777777 | 0 |
| 0.8222222222222223 | 0 |
| 0.8229166666666666 | 0 |
| 0.8236111111111111 | 0 |
| 0.8243055555555556 | 0 |
| 0.8250000000000001 | 0 |
| 0.8256944444444444 | 0 |
| 0.8263888888888888 | 0 |
| 0.8270833333333334 | 0 |
| 0.8277777777777778 | 0 |
| 0.8284722222222222 | 0 |
| 0.8291666666666666 | 0 |
| 0.8298611111111112 | 0 |
| 0.8305555555555556 | 0 |
| 0.8312499999999999 | 0 |
| 0.8319444444444444 | 0 |
| 0.8326388888888889 | 0 |
| 0.8333333333333334 | 0 |
| 0.8340277777777777 | 0 |
| 0.8347222222222223 | 0 |
| 0.8354166666666667 | 0 |
| 0.8361111111111111 | 0 |
| 0.8368055555555555 | 0 |
| 0.8375 | 0 |
| 0.8381944444444445 | 0 |
| 0.8388888888888889 | 0 |
| 0.8395833333333332 | 0 |
| 0.8402777777777778 | 0 |
| 0.8409722222222222 | 0 |
| 0.8416666666666667 | 0 |
| 0.842361111111111 | 0 |
| 0.8430555555555556 | 0 |
| 0.84375 | 0 |
| 0.8444444444444444 | 0 |
| 0.845138888888889 | 0 |
| 0.8458333333333333 | 0 |
| 0.8465277777777778 | 0 |
| 0.8472222222222222 | 0 |
| 0.8479166666666668 | 0 |
| 0.8486111111111111 | 0 |
| 0.8493055555555555 | 0 |
| 0.85 | 0 |
| 0.8506944444444445 | 0 |
| 0.8513888888888889 | 0 |
| 0.8520833333333333 | 0 |
| 0.8527777777777777 | 0 |
| 0.8534722222222223 | 0 |
| 0.8541666666666666 | 0 |
| 0.8548611111111111 | 0 |
| 0.8555555555555556 | 0 |
| 0.8562500000000001 | 0 |
| 0.8569444444444444 | 0 |
| 0.8576388888888888 | 0 |
| 0.8583333333333334 | 0 |
| 0.8590277777777778 | 0 |
| 0.8597222222222222 | 0 |
| 0.8604166666666666 | 0 |
| 0.8611111111111112 | 0 |
| 0.8618055555555556 | 0 |
| 0.8624999999999999 | 0 |
| 0.8631944444444444 | 0 |
| 0.8638888888888889 | 0 |
| 0.8645833333333334 | 0 |
| 0.8652777777777777 | 0 |
| 0.8659722222222223 | 0 |
| 0.8666666666666667 | 0 |
| 0.8673611111111111 | 0 |
| 0.8680555555555555 | 0 |
| 0.86875 | 0 |
| 0.8694444444444445 | 0 |
| 0.8701388888888889 | 0 |
| 0.8708333333333332 | 0 |
| 0.8715277777777778 | 0 |
| 0.8722222222222222 | 0 |
| 0.8729166666666667 | 0 |
| 0.873611111111111 | 0 |
| 0.8743055555555556 | 0 |
| 0.875 | 0 |
| 0.8756944444444444 | 0 |
| 0.876388888888889 | 0 |
| 0.8770833333333333 | 0 |
| 0.8777777777777778 | 0 |
| 0.8784722222222222 | 0 |
| 0.8791666666666668 | 0 |
| 0.8798611111111111 | 0 |
| 0.8805555555555555 | 0 |
| 0.88125 | 0 |
| 0.8819444444444445 | 0 |
| 0.8826388888888889 | 0 |
| 0.8833333333333333 | 0 |
| 0.8840277777777777 | 0 |
| 0.8847222222222223 | 0 |
| 0.8854166666666666 | 0 |
| 0.8861111111111111 | 0 |
| 0.8868055555555556 | 0 |
| 0.8875000000000001 | 0 |
| 0.8881944444444444 | 0 |
| 0.8888888888888888 | 0 |
| 0.8895833333333334 | 0 |
| 0.8902777777777778 | 0 |
| 0.8909722222222222 | 0 |
| 0.8916666666666666 | 0 |
| 0.8923611111111112 | 0 |
| 0.8930555555555556 | 0 |
| 0.8937499999999999 | 0 |
| 0.8944444444444444 | 0 |
| 0.8951388888888889 | 0 |
| 0.8958333333333334 | 0 |
| 0.8965277777777777 | 0 |
| 0.8972222222222223 | 0 |
| 0.8979166666666667 | 0 |
| 0.8986111111111111 | 0 |
| 0.8993055555555555 | 0 |
| 0.9 | 0 |
| 0.9006944444444445 | 0 |
| 0.9013888888888889 | 0 |
| 0.9020833333333332 | 0 |
| 0.9027777777777778 | 0 |
| 0.9034722222222222 | 0 |
| 0.9041666666666667 | 0 |
| 0.904861111111111 | 0 |
| 0.9055555555555556 | 0 |
| 0.90625 | 0 |
| 0.9069444444444444 | 0 |
| 0.907638888888889 | 0 |
| 0.9083333333333333 | 0 |
| 0.9090277777777778 | 0 |
| 0.9097222222222222 | 0 |
| 0.9104166666666668 | 0 |
| 0.9111111111111111 | 0 |
| 0.9118055555555555 | 0 |
| 0.9125 | 0 |
| 0.9131944444444445 | 0 |
| 0.9138888888888889 | 0 |
| 0.9145833333333333 | 0 |
| 0.9152777777777777 | 0 |
| 0.9159722222222223 | 0 |
| 0.9166666666666666 | 0 |
| 0.9173611111111111 | 0 |
| 0.9180555555555556 | 0 |
| 0.9187500000000001 | 0 |
| 0.9194444444444444 | 0 |
| 0.9201388888888888 | 0 |
| 0.9208333333333334 | 0 |
| 0.9215277777777778 | 0 |
| 0.9222222222222222 | 0 |
| 0.9229166666666666 | 0 |
| 0.9236111111111112 | 0 |
| 0.9243055555555556 | 0 |
| 0.9249999999999999 | 0 |
| 0.9256944444444444 | 0 |
| 0.9263888888888889 | 0 |
| 0.9270833333333334 | 0 |
| 0.9277777777777777 | 0 |
| 0.9284722222222223 | 0 |
| 0.9291666666666667 | 0 |
| 0.9298611111111111 | 0 |
| 0.9305555555555555 | 0 |
| 0.93125 | 0 |
| 0.9319444444444445 | 0 |
| 0.9326388888888889 | 0 |
| 0.9333333333333332 | 0 |
| 0.9340277777777778 | 0 |
| 0.9347222222222222 | 0 |
| 0.9354166666666667 | 0 |
| 0.936111111111111 | 0 |
| 0.9368055555555556 | 0 |
| 0.9375 | 0 |
| 0.9381944444444444 | 0 |
| 0.938888888888889 | 0 |
| 0.9395833333333333 | 0 |
| 0.9402777777777778 | 0 |
| 0.9409722222222222 | 0 |
| 0.9416666666666668 | 0 |
| 0.9423611111111111 | 0 |
| 0.9430555555555555 | 0 |
| 0.94375 | 0 |
| 0.9444444444444445 | 0 |
| 0.9451388888888889 | 0 |
| 0.9458333333333333 | 0 |
| 0.9465277777777777 | 0 |
| 0.9472222222222223 | 0 |
| 0.9479166666666666 | 0 |
| 0.9486111111111111 | 0 |
| 0.9493055555555556 | 0 |
| 0.9500000000000001 | 0 |
| 0.9506944444444444 | 0 |
| 0.9513888888888888 | 0 |
| 0.9520833333333334 | 0 |
| 0.9527777777777778 | 0 |
| 0.9534722222222222 | 0 |
| 0.9541666666666666 | 0 |
| 0.9548611111111112 | 0 |
| 0.9555555555555556 | 0 |
| 0.9562499999999999 | 0 |
| 0.9569444444444444 | 0 |
| 0.9576388888888889 | 0 |
| 0.9583333333333334 | 0 |
| 0.9590277777777777 | 0 |
| 0.9597222222222223 | 0 |
| 0.9604166666666667 | 0 |
| 0.9611111111111111 | 0 |
| 0.9618055555555555 | 0 |
| 0.9625 | 0 |
| 0.9631944444444445 | 0 |
| 0.9638888888888889 | 0 |
| 0.9645833333333332 | 0 |
| 0.9652777777777778 | 0 |
| 0.9659722222222222 | 0 |
| 0.9666666666666667 | 0 |
| 0.967361111111111 | 0 |
| 0.9680555555555556 | 0 |
| 0.96875 | 0 |
| 0.9694444444444444 | 0 |
| 0.970138888888889 | 0 |
| 0.9708333333333333 | 0 |
| 0.9715277777777778 | 0 |
| 0.9722222222222222 | 0 |
| 0.9729166666666668 | 0 |
| 0.9736111111111111 | 0 |
| 0.9743055555555555 | 0 |
| 0.975 | 0 |
| 0.9756944444444445 | 0 |
| 0.9763888888888889 | 0 |
| 0.9770833333333333 | 0 |
| 0.9777777777777777 | 0 |
| 0.9784722222222223 | 0 |
| 0.9791666666666666 | 0 |
| 0.9798611111111111 | 0 |
| 0.9805555555555556 | 0 |
| 0.9812500000000001 | 0 |
| 0.9819444444444444 | 0 |
| 0.9826388888888888 | 0 |
| 0.9833333333333334 | 0 |
| 0.9840277777777778 | 0 |
| 0.9847222222222222 | 0 |
| 0.9854166666666666 | 0 |
| 0.9861111111111112 | 0 |
| 0.9868055555555556 | 0 |
| 0.9874999999999999 | 0 |
| 0.9881944444444444 | 0 |
| 0.9888888888888889 | 0 |
| 0.9895833333333334 | 0 |
| 0.9902777777777777 | 0 |
| 0.9909722222222223 | 0 |
| 0.9916666666666667 | 0 |
| 0.9923611111111111 | 0 |
| 0.9930555555555555 | 0 |
| 0.99375 | 0 |
| 0.9944444444444445 | 0 |
| 0.9951388888888889 | 0 |
| 0.9958333333333332 | 0 |
| 0.9965277777777778 | 0 |
| 0.9972222222222222 | 0 |
| 0.9979166666666667 | 0 |
| 0.998611111111111 | 0 |
| 0.9993055555555556 | 0 |